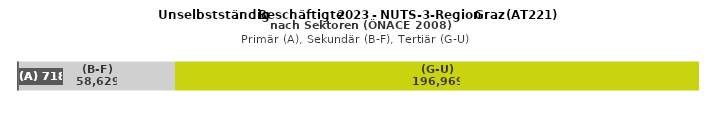
| Category | (A) | (B-F) | (G-U) |
|---|---|---|---|
| 0 | 718 | 58629 | 196969 |